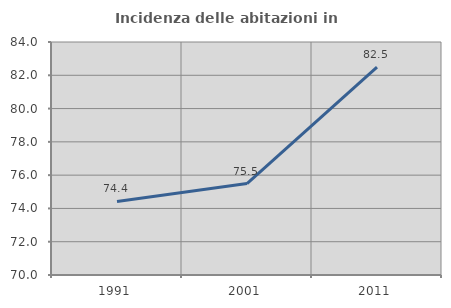
| Category | Incidenza delle abitazioni in proprietà  |
|---|---|
| 1991.0 | 74.419 |
| 2001.0 | 75.497 |
| 2011.0 | 82.493 |